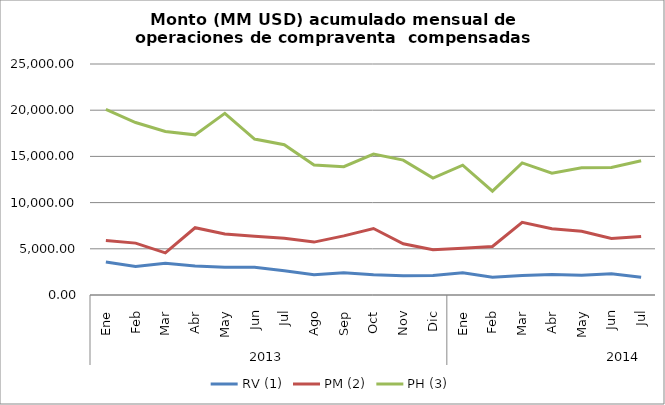
| Category | RV (1) | PM (2) | PH (3) |
|---|---|---|---|
| 0 | 3582.113 | 5901.651 | 20087.034 |
| 1 | 3086.223 | 5614.086 | 18662.914 |
| 2 | 3427.503 | 4559.027 | 17696.541 |
| 3 | 3146.302 | 7279.906 | 17332.385 |
| 4 | 2992.826 | 6596.857 | 19663.42 |
| 5 | 3012.804 | 6346.526 | 16878.408 |
| 6 | 2618.878 | 6139.885 | 16263.385 |
| 7 | 2182.732 | 5724.829 | 14069.305 |
| 8 | 2409.674 | 6399.577 | 13889.23 |
| 9 | 2180.079 | 7195.606 | 15254.774 |
| 10 | 2095.442 | 5541.836 | 14598.61 |
| 11 | 2104.88 | 4905.995 | 12657.524 |
| 12 | 2410.581 | 5047.1 | 14052.921 |
| 13 | 1913.3 | 5251.955 | 11240.27 |
| 14 | 2111.981 | 7861.413 | 14290.324 |
| 15 | 2223.473 | 7175.644 | 13176.799 |
| 16 | 2125.013 | 6892.343 | 13776.518 |
| 17 | 2301.328 | 6106.398 | 13805.87 |
| 18 | 1924.188 | 6332.088 | 14535.523 |